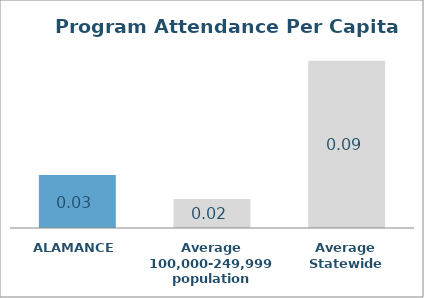
| Category | Series 0 |
|---|---|
| ALAMANCE | 0.028 |
| Average 100,000-249,999 population | 0.015 |
| Average Statewide | 0.089 |